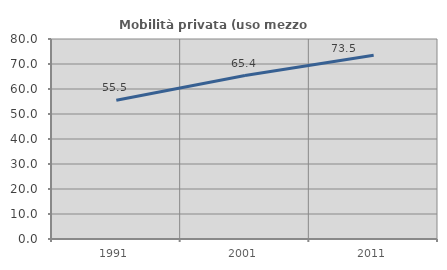
| Category | Mobilità privata (uso mezzo privato) |
|---|---|
| 1991.0 | 55.495 |
| 2001.0 | 65.379 |
| 2011.0 | 73.492 |